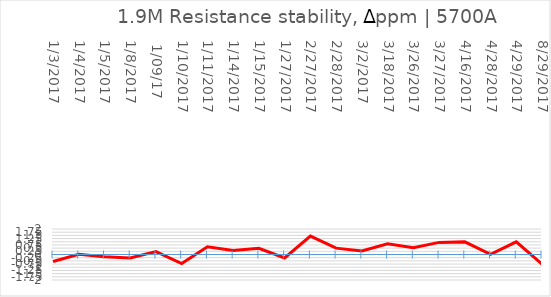
| Category | Series 0 |
|---|---|
| 1/3/2017 | -0.55 |
| 1/4/2017 | 0.02 |
| 1/5/2017 | -0.17 |
| 1/8/2017 | -0.28 |
|  1/09/17 | 0.23 |
| 1/10/2017 | -0.71 |
| 1/11/2017 | 0.6 |
| 1/14/2017 | 0.31 |
| 1/15/2017 | 0.48 |
| 1/27/2017 | -0.27 |
| 2/27/2017 | 1.44 |
| 2/28/2017 | 0.5 |
| 3/2/2017 | 0.27 |
| 3/18/2017 | 0.84 |
| 3/26/2017 | 0.53 |
| 3/27/2017 | 0.95 |
| 4/16/2017 | 0.99 |
| 4/28/2017 | 0.01 |
| 4/29/2017 | 0.99 |
| 8/29/2017 | -0.75 |